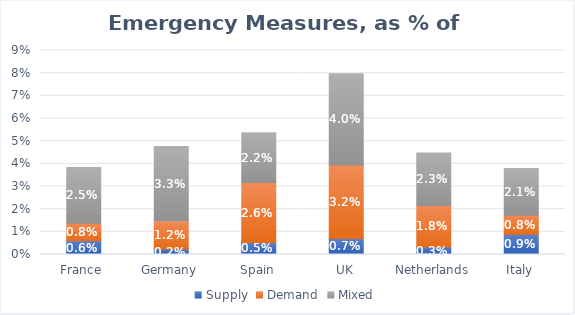
| Category | Supply | Demand | Mixed |
|---|---|---|---|
| France  | 0.006 | 0.008 | 0.025 |
| Germany | 0.002 | 0.012 | 0.033 |
| Spain | 0.005 | 0.026 | 0.022 |
| UK | 0.007 | 0.032 | 0.04 |
| Netherlands | 0.003 | 0.018 | 0.023 |
| Italy | 0.009 | 0.008 | 0.021 |